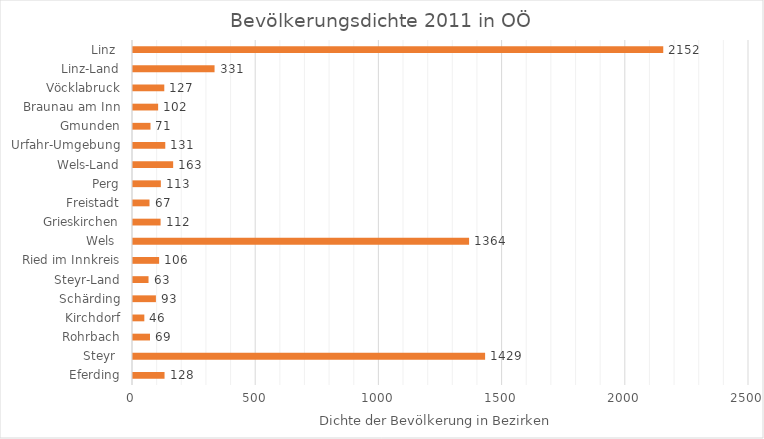
| Category | Series 0 |
|---|---|
| Eferding | 128 |
| Steyr  | 1429 |
| Rohrbach | 69 |
| Kirchdorf | 46 |
| Schärding | 93 |
| Steyr-Land | 63 |
| Ried im Innkreis | 106 |
| Wels  | 1364 |
| Grieskirchen | 112 |
| Freistadt | 67 |
| Perg | 113 |
| Wels-Land | 163 |
| Urfahr-Umgebung | 131 |
| Gmunden | 71 |
| Braunau am Inn | 102 |
| Vöcklabruck | 127 |
| Linz-Land | 331 |
| Linz  | 2152 |